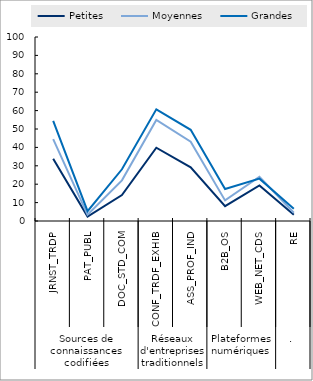
| Category | Petites | Moyennes | Grandes |
|---|---|---|---|
| 0 | 33.841 | 44.529 | 54.465 |
| 1 | 2.412 | 3.367 | 5.313 |
| 2 | 14.106 | 22.094 | 28.118 |
| 3 | 39.812 | 54.929 | 60.676 |
| 4 | 29.125 | 43.062 | 49.544 |
| 5 | 8.035 | 11.176 | 17.388 |
| 6 | 19.347 | 24.065 | 23.029 |
| 7 | 3.429 | 4.475 | 6.694 |